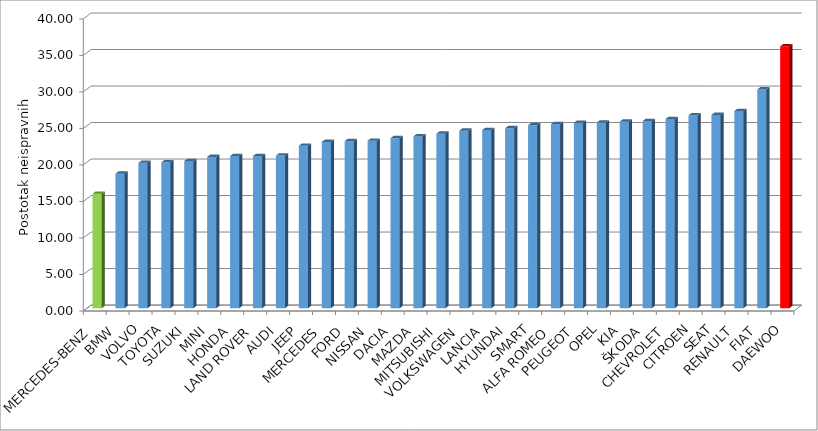
| Category | Series 4 |
|---|---|
| MERCEDES-BENZ | 15.661 |
| BMW | 18.423 |
| VOLVO | 19.902 |
| TOYOTA | 19.979 |
| SUZUKI | 20.152 |
| MINI | 20.718 |
| HONDA | 20.827 |
| LAND ROVER | 20.837 |
| AUDI | 20.901 |
| JEEP | 22.241 |
| MERCEDES | 22.763 |
| FORD | 22.874 |
| NISSAN | 22.928 |
| DACIA | 23.28 |
| MAZDA | 23.527 |
| MITSUBISHI | 23.894 |
| VOLKSWAGEN | 24.307 |
| LANCIA | 24.393 |
| HYUNDAI | 24.646 |
| SMART | 25.061 |
| ALFA ROMEO | 25.224 |
| PEUGEOT | 25.392 |
| OPEL | 25.429 |
| KIA | 25.546 |
| ŠKODA | 25.62 |
| CHEVROLET | 25.904 |
| CITROEN | 26.422 |
| SEAT | 26.459 |
| RENAULT | 26.997 |
| FIAT | 29.959 |
| DAEWOO | 35.859 |